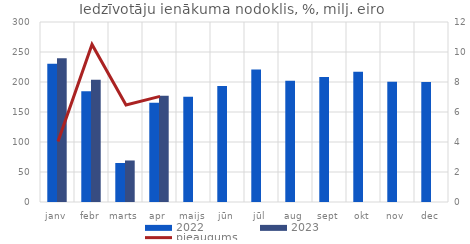
| Category | 2022 | 2023 |
|---|---|---|
| janv | 230.249 | 239.534 |
| febr | 184.559 | 203.945 |
| marts | 65.002 | 69.21 |
| apr | 165.307 | 176.948 |
| maijs | 175.243 | 0 |
| jūn | 193.472 | 0 |
| jūl | 220.964 | 0 |
| aug | 202.017 | 0 |
| sept | 208.39 | 0 |
| okt | 217.091 | 0 |
| nov | 200.285 | 0 |
| dec | 199.898 | 0 |